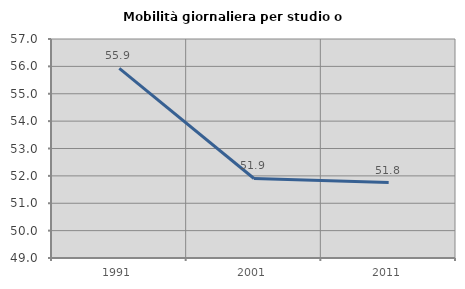
| Category | Mobilità giornaliera per studio o lavoro |
|---|---|
| 1991.0 | 55.924 |
| 2001.0 | 51.905 |
| 2011.0 | 51.754 |